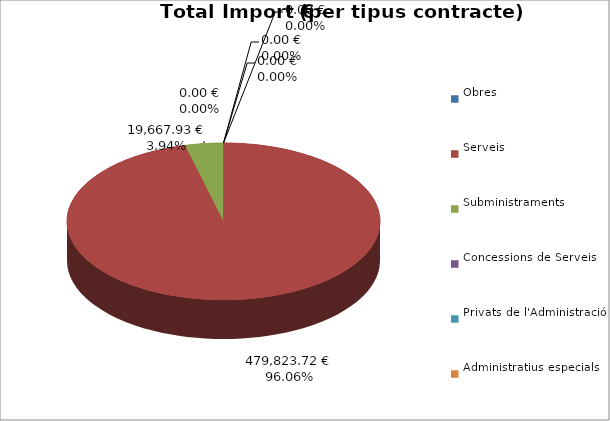
| Category | Total preu
(amb IVA) |
|---|---|
| Obres | 0 |
| Serveis | 479823.725 |
| Subministraments | 19667.93 |
| Concessions de Serveis | 0 |
| Privats de l'Administració | 0 |
| Administratius especials | 0 |